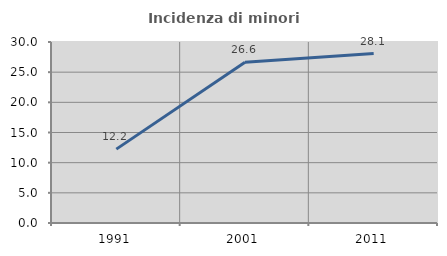
| Category | Incidenza di minori stranieri |
|---|---|
| 1991.0 | 12.245 |
| 2001.0 | 26.63 |
| 2011.0 | 28.094 |